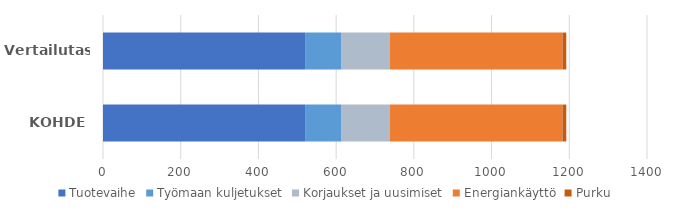
| Category | Tuotevaihe | Työmaan kuljetukset | Korjaukset ja uusimiset | Energiankäyttö | Purku |
|---|---|---|---|---|---|
| KOHDE | 520 | 94 | 123.8 | 444.57 | 10 |
| Vertailutaso | 520 | 94 | 123.8 | 444.57 | 10 |